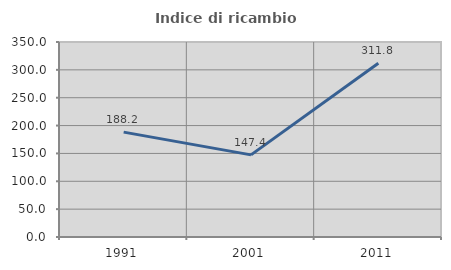
| Category | Indice di ricambio occupazionale  |
|---|---|
| 1991.0 | 188.235 |
| 2001.0 | 147.368 |
| 2011.0 | 311.765 |